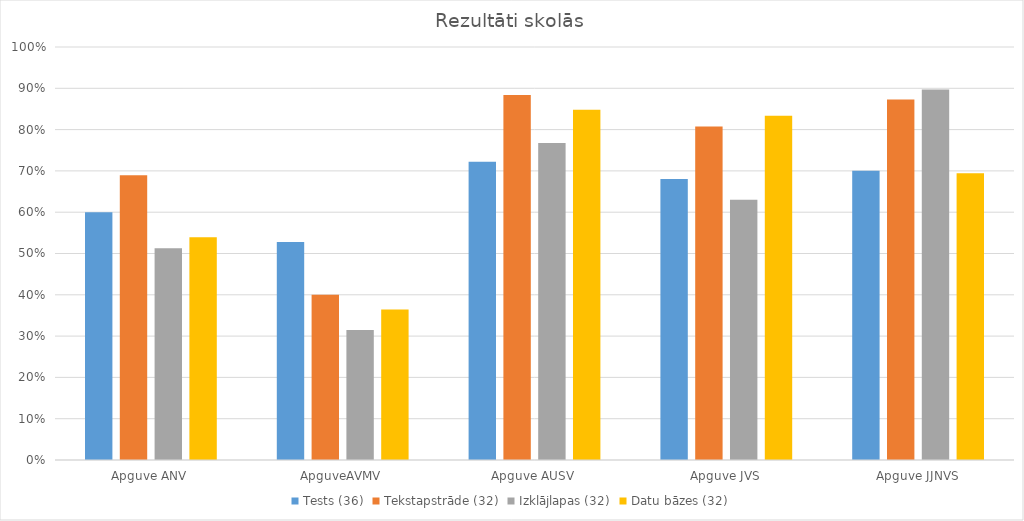
| Category | Tests (36) | Tekstapstrāde (32) | Izklājlapas (32) | Datu bāzes (32) |
|---|---|---|---|---|
| Apguve ANV | 0.6 | 0.69 | 0.512 | 0.54 |
| ApguveAVMV | 0.528 | 0.4 | 0.315 | 0.365 |
| Apguve AUSV | 0.722 | 0.884 | 0.768 | 0.848 |
| Apguve JVS | 0.681 | 0.807 | 0.63 | 0.833 |
| Apguve JJNVS | 0.7 | 0.873 | 0.897 | 0.694 |